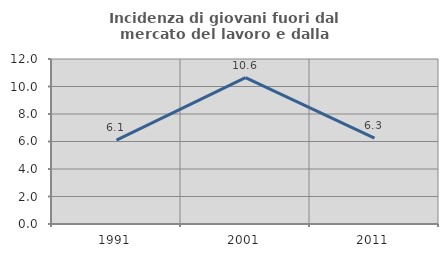
| Category | Incidenza di giovani fuori dal mercato del lavoro e dalla formazione  |
|---|---|
| 1991.0 | 6.098 |
| 2001.0 | 10.638 |
| 2011.0 | 6.25 |